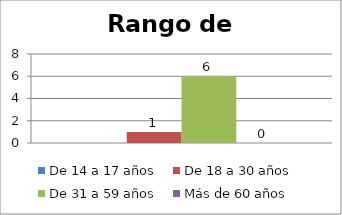
| Category | De 14 a 17 años | De 18 a 30 años  | De 31 a 59 años  | Más de 60 años  |
|---|---|---|---|---|
| 0 |  | 1 | 6 | 0 |